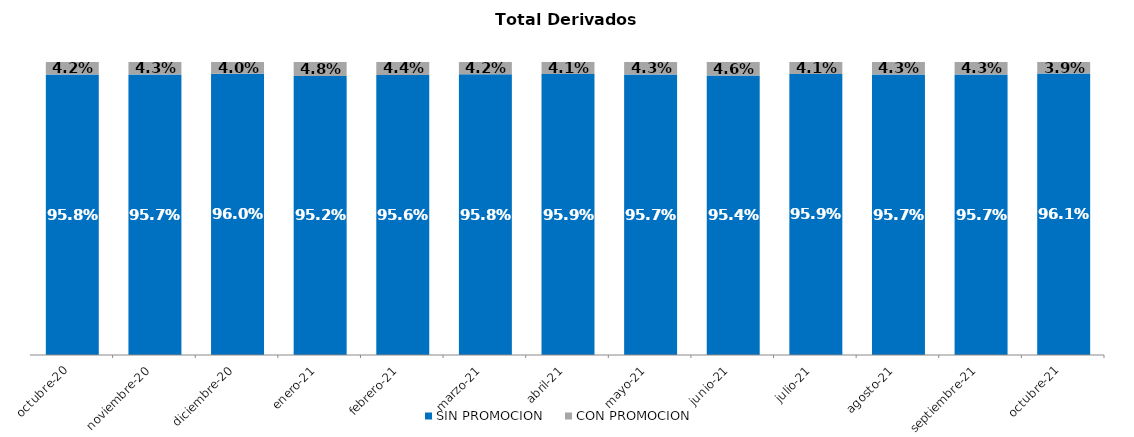
| Category | SIN PROMOCION   | CON PROMOCION   |
|---|---|---|
| 2020-10-01 | 0.958 | 0.042 |
| 2020-11-01 | 0.957 | 0.043 |
| 2020-12-01 | 0.96 | 0.04 |
| 2021-01-01 | 0.952 | 0.048 |
| 2021-02-01 | 0.956 | 0.044 |
| 2021-03-01 | 0.958 | 0.042 |
| 2021-04-01 | 0.959 | 0.041 |
| 2021-05-01 | 0.957 | 0.043 |
| 2021-06-01 | 0.954 | 0.046 |
| 2021-07-01 | 0.959 | 0.041 |
| 2021-08-01 | 0.957 | 0.043 |
| 2021-09-01 | 0.957 | 0.043 |
| 2021-10-01 | 0.961 | 0.039 |